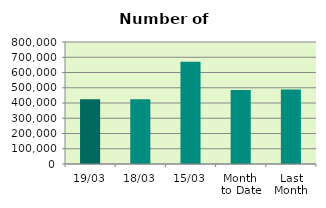
| Category | Series 0 |
|---|---|
| 19/03 | 425272 |
| 18/03 | 424112 |
| 15/03 | 671244 |
| Month 
to Date | 485814.462 |
| Last
Month | 488116.6 |